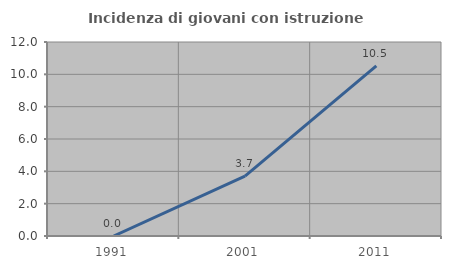
| Category | Incidenza di giovani con istruzione universitaria |
|---|---|
| 1991.0 | 0 |
| 2001.0 | 3.704 |
| 2011.0 | 10.526 |